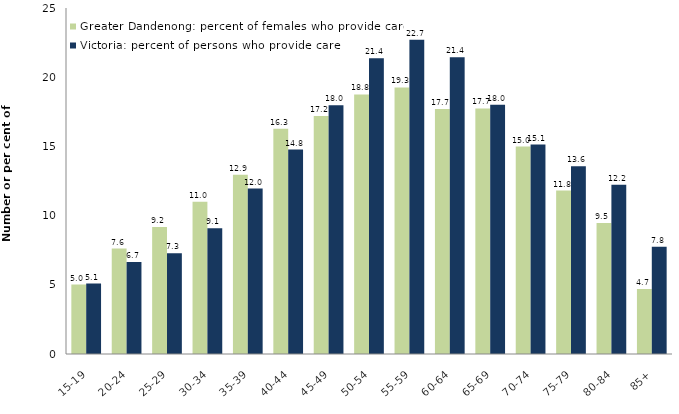
| Category | Greater Dandenong: percent of females who provide care | Victoria: percent of persons who provide care |
|---|---|---|
| 15-19 | 5.017 | 5.091 |
| 20-24 | 7.622 | 6.654 |
| 25-29 | 9.172 | 7.28 |
| 30-34 | 11.001 | 9.083 |
| 35-39 | 12.946 | 11.951 |
| 40-44 | 16.268 | 14.776 |
| 45-49 | 17.189 | 17.967 |
| 50-54 | 18.759 | 21.362 |
| 55-59 | 19.263 | 22.697 |
| 60-64 | 17.711 | 21.445 |
| 65-69 | 17.747 | 18.016 |
| 70-74 | 14.984 | 15.129 |
| 75-79 | 11.811 | 13.564 |
| 80-84 | 9.459 | 12.221 |
| 85+ | 4.703 | 7.755 |